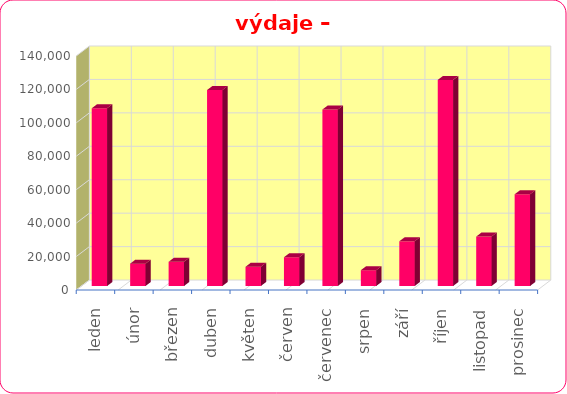
| Category | Series 0 |
|---|---|
| leden | 106300 |
| únor | 13378 |
| březen | 14480 |
| duben | 117200 |
| květen | 11510 |
| červen | 17200 |
| červenec | 105560 |
| srpen | 9440 |
| září | 26740 |
| říjen | 123280 |
| listopad | 29580 |
| prosinec | 54850 |